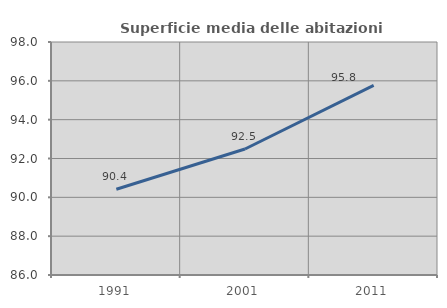
| Category | Superficie media delle abitazioni occupate |
|---|---|
| 1991.0 | 90.417 |
| 2001.0 | 92.489 |
| 2011.0 | 95.767 |